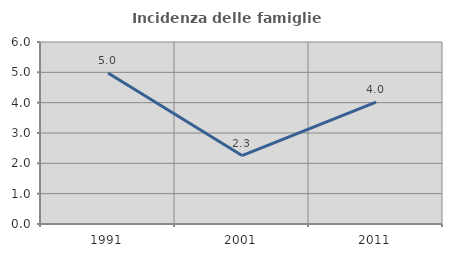
| Category | Incidenza delle famiglie numerose |
|---|---|
| 1991.0 | 4.975 |
| 2001.0 | 2.256 |
| 2011.0 | 4.02 |